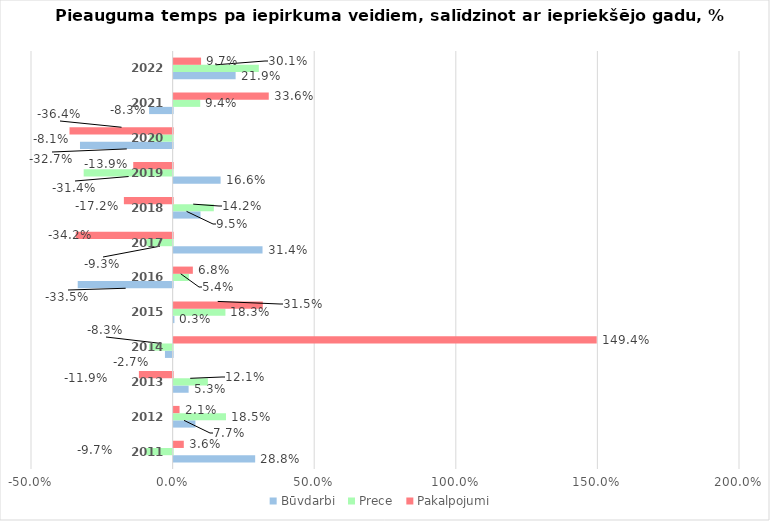
| Category | Būvdarbi | Prece | Pakalpojumi |
|---|---|---|---|
| 2011.0 | 0.288 | -0.097 | 0.036 |
| 2012.0 | 0.077 | 0.185 | 0.021 |
| 2013.0 | 0.053 | 0.121 | -0.119 |
| 2014.0 | -0.027 | -0.083 | 1.494 |
| 2015.0 | 0.003 | 0.183 | 0.315 |
| 2016.0 | -0.335 | 0.054 | 0.068 |
| 2017.0 | 0.314 | -0.093 | -0.342 |
| 2018.0 | 0.095 | 0.142 | -0.172 |
| 2019.0 | 0.166 | -0.314 | -0.139 |
| 2020.0 | -0.327 | -0.081 | -0.364 |
| 2021.0 | -0.083 | 0.094 | 0.336 |
| 2022.0 | 0.219 | 0.301 | 0.097 |